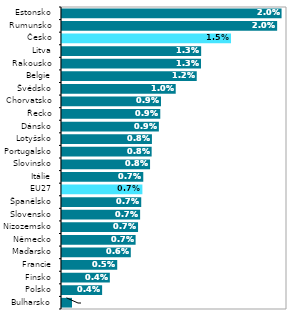
| Category |  2020* |
|---|---|
| Bulharsko | 0.001 |
| Polsko | 0.004 |
| Finsko | 0.004 |
| Francie | 0.005 |
| Maďarsko | 0.006 |
| Německo | 0.007 |
| Nizozemsko | 0.007 |
| Slovensko | 0.007 |
| Španělsko | 0.007 |
| EU27 | 0.007 |
| Itálie | 0.007 |
| Slovinsko | 0.008 |
| Portugalsko | 0.008 |
| Lotyšsko | 0.008 |
| Dánsko | 0.009 |
| Řecko | 0.009 |
| Chorvatsko | 0.009 |
| Švédsko | 0.01 |
| Belgie | 0.012 |
| Rakousko | 0.013 |
| Litva | 0.013 |
| Česko | 0.015 |
| Rumunsko | 0.02 |
| Estonsko | 0.02 |